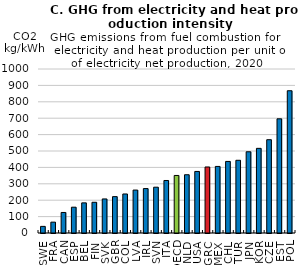
| Category | GHG emissions from fuel combustion for Electricity and heat production / Electricity net production |
|---|---|
| SWE | 40.368 |
| FRA | 66.132 |
| CAN | 125.183 |
| ESP | 157.359 |
| BEL | 183.773 |
| FIN | 187.241 |
| SVK | 207.667 |
| GBR | 221.781 |
| COL | 237.974 |
| LVA | 261.733 |
| IRL | 270.929 |
| SVN | 279.312 |
| ITA | 320.143 |
| OECD | 350.806 |
| NLD | 355.271 |
| USA | 375.292 |
| GRC | 402.587 |
| MEX | 405.938 |
| CHL | 436.451 |
| TUR | 443.404 |
| JPN | 495.327 |
| KOR | 516.156 |
| CZE | 568.862 |
| EST | 696.181 |
| POL | 867.41 |